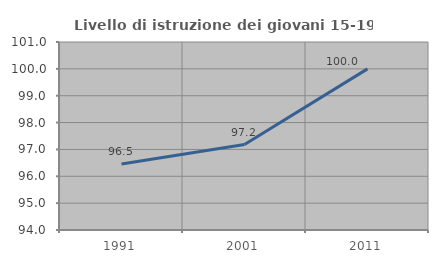
| Category | Livello di istruzione dei giovani 15-19 anni |
|---|---|
| 1991.0 | 96.458 |
| 2001.0 | 97.183 |
| 2011.0 | 100 |